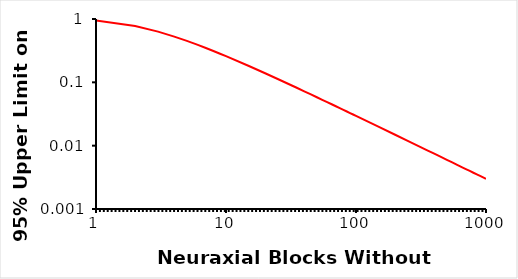
| Category | Risk |
|---|---|
| 1.0 | 0.95 |
| 2.0 | 0.776 |
| 3.0 | 0.632 |
| 4.0 | 0.527 |
| 5.0 | 0.451 |
| 6.0 | 0.393 |
| 7.0 | 0.348 |
| 8.0 | 0.312 |
| 9.0 | 0.283 |
| 10.0 | 0.259 |
| 15.0 | 0.181 |
| 20.0 | 0.139 |
| 25.0 | 0.113 |
| 30.0 | 0.095 |
| 35.0 | 0.082 |
| 40.0 | 0.072 |
| 45.0 | 0.064 |
| 50.0 | 0.058 |
| 55.0 | 0.053 |
| 60.0 | 0.049 |
| 65.0 | 0.045 |
| 70.0 | 0.042 |
| 75.0 | 0.039 |
| 80.0 | 0.037 |
| 85.0 | 0.035 |
| 90.0 | 0.033 |
| 95.0 | 0.031 |
| 100.0 | 0.03 |
| 150.0 | 0.02 |
| 200.0 | 0.015 |
| 250.0 | 0.012 |
| 300.0 | 0.01 |
| 350.0 | 0.009 |
| 400.0 | 0.007 |
| 450.0 | 0.007 |
| 500.0 | 0.006 |
| 550.0 | 0.005 |
| 600.0 | 0.005 |
| 650.0 | 0.005 |
| 700.0 | 0.004 |
| 750.0 | 0.004 |
| 800.0 | 0.004 |
| 850.0 | 0.004 |
| 900.0 | 0.003 |
| 950.0 | 0.003 |
| 1000.0 | 0.003 |